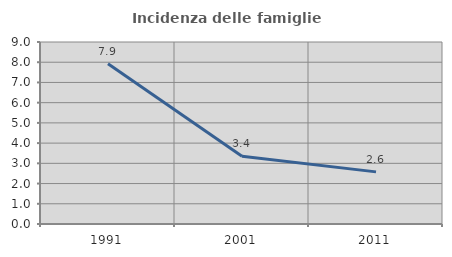
| Category | Incidenza delle famiglie numerose |
|---|---|
| 1991.0 | 7.923 |
| 2001.0 | 3.351 |
| 2011.0 | 2.577 |